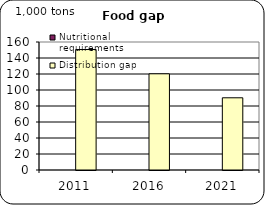
| Category | Nutritional requirements | Distribution gap |
|---|---|---|
| 2011.0 | 0 | 150.6 |
| 2016.0 | 0 | 120.269 |
| 2021.0 | 0 | 90.267 |